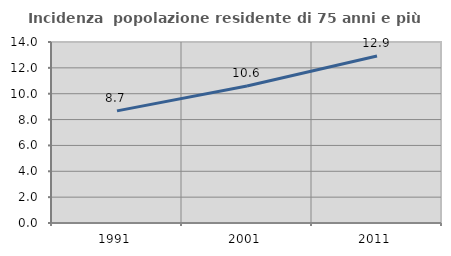
| Category | Incidenza  popolazione residente di 75 anni e più |
|---|---|
| 1991.0 | 8.673 |
| 2001.0 | 10.597 |
| 2011.0 | 12.919 |